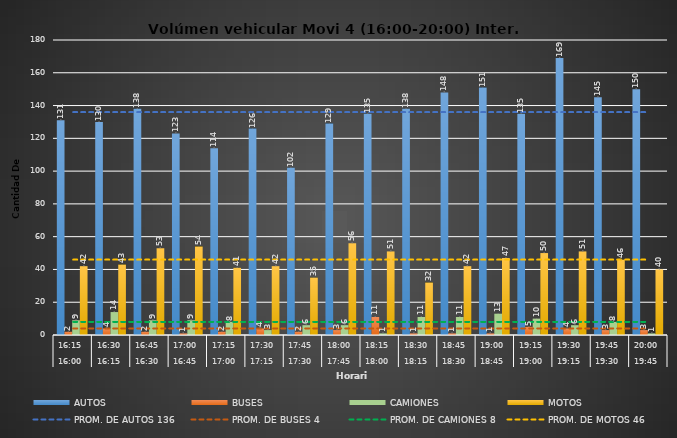
| Category | AUTOS | BUSES | CAMIONES | MOTOS |
|---|---|---|---|---|
| 0 | 131 | 2 | 9 | 42 |
| 1 | 130 | 4 | 14 | 43 |
| 2 | 138 | 2 | 9 | 53 |
| 3 | 123 | 1 | 9 | 54 |
| 4 | 114 | 2 | 8 | 41 |
| 5 | 126 | 4 | 3 | 42 |
| 6 | 102 | 2 | 6 | 35 |
| 7 | 129 | 3 | 6 | 56 |
| 8 | 135 | 11 | 1 | 51 |
| 9 | 138 | 1 | 11 | 32 |
| 10 | 148 | 1 | 11 | 42 |
| 11 | 151 | 1 | 13 | 47 |
| 12 | 135 | 5 | 10 | 50 |
| 13 | 169 | 4 | 6 | 51 |
| 14 | 145 | 3 | 8 | 46 |
| 15 | 150 | 3 | 1 | 40 |